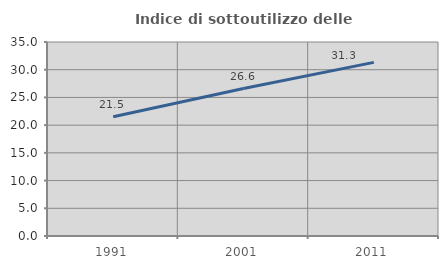
| Category | Indice di sottoutilizzo delle abitazioni  |
|---|---|
| 1991.0 | 21.53 |
| 2001.0 | 26.608 |
| 2011.0 | 31.328 |